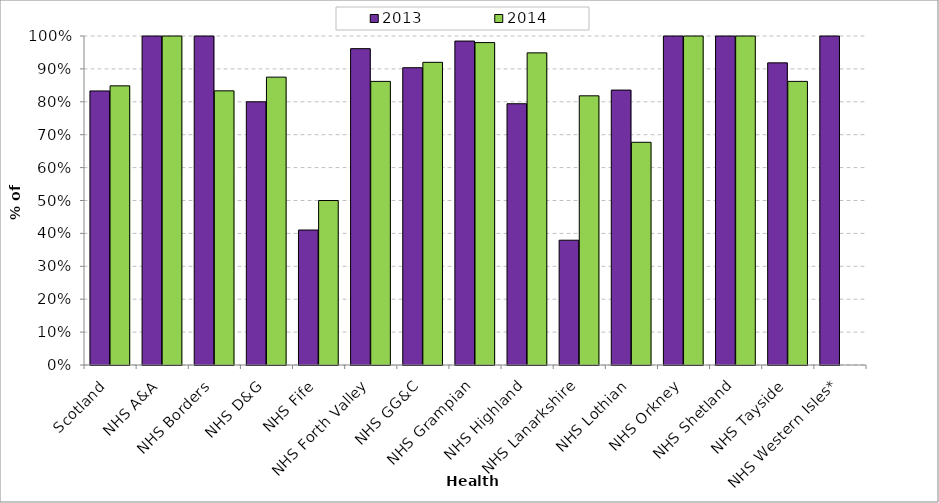
| Category | 2013 | 2014 |
|---|---|---|
| Scotland | 0.833 | 0.848 |
| NHS A&A | 1 | 1 |
| NHS Borders | 1 | 0.833 |
| NHS D&G | 0.8 | 0.875 |
| NHS Fife | 0.41 | 0.5 |
| NHS Forth Valley | 0.962 | 0.862 |
| NHS GG&C | 0.904 | 0.92 |
| NHS Grampian | 0.985 | 0.98 |
| NHS Highland | 0.794 | 0.949 |
| NHS Lanarkshire | 0.379 | 0.818 |
| NHS Lothian | 0.836 | 0.677 |
| NHS Orkney | 1 | 1 |
| NHS Shetland | 1 | 1 |
| NHS Tayside | 0.918 | 0.862 |
| NHS Western Isles* | 1 | 0 |